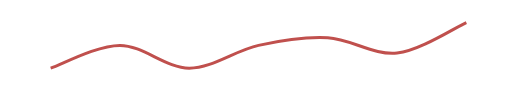
| Category | Series 0 |
|---|---|
| 0 | 3 |
| 1 | 6 |
| 2 | 3 |
| 3 | 6 |
| 4 | 7 |
| 5 | 5 |
| 6 | 9 |